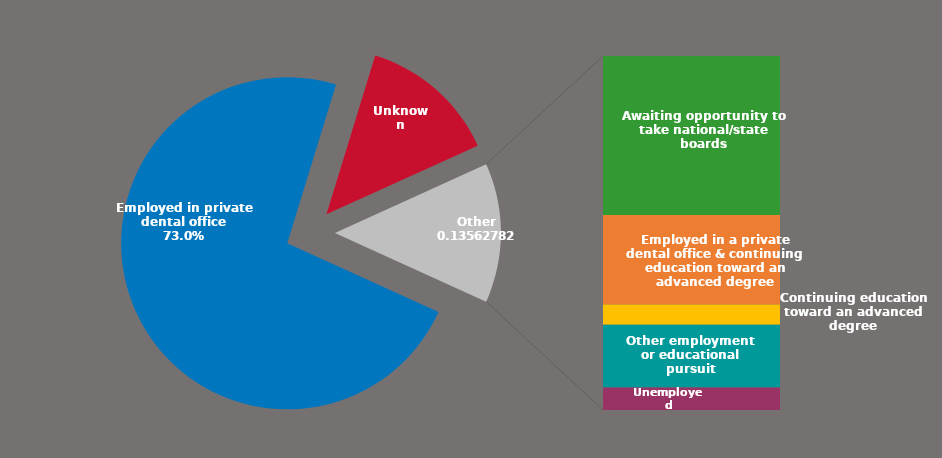
| Category | Series 0 |
|---|---|
| Employed in private dental office | 0.73 |
| Unknown | 0.135 |
| Awaiting opportunity to take national/state boards | 0.061 |
| Employed in a private dental office & continuing education toward an advanced degree | 0.034 |
| Continuing education toward an advanced degree | 0.008 |
| Other employment or educational pursuit | 0.024 |
| Unemployed | 0.009 |